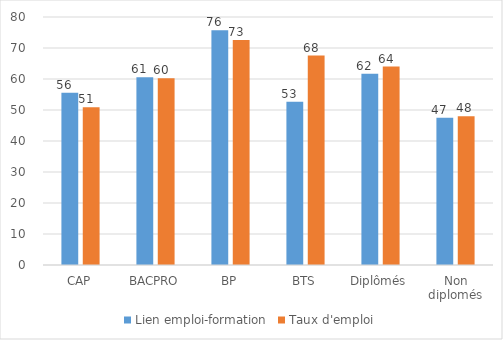
| Category | Lien emploi-formation | Taux d'emploi |
|---|---|---|
| CAP | 55.55 | 50.88 |
| BACPRO | 60.6 | 60.25 |
| BP | 75.76 | 72.58 |
| BTS | 52.7 | 67.55 |
| Diplômés | 61.72 | 64 |
| Non diplomés | 47.49 | 48 |